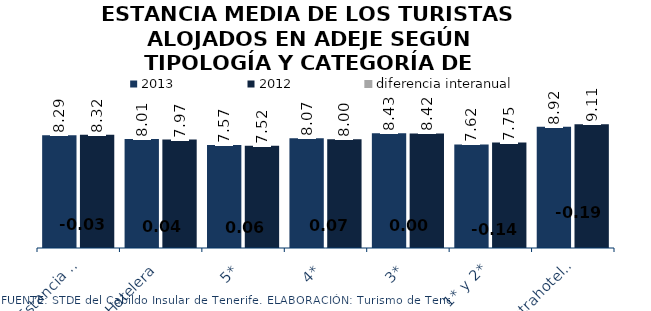
| Category | 2013 | 2012 |
|---|---|---|
| Estancia media total | 8.286 | 8.319 |
| Hotelera | 8.015 | 7.974 |
| 5* | 7.573 | 7.515 |
| 4* | 8.069 | 8.002 |
| 3* | 8.429 | 8.424 |
| 1* y 2* | 7.615 | 7.751 |
| Extrahotelera | 8.918 | 9.107 |